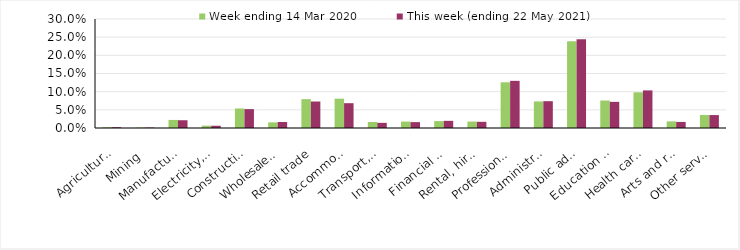
| Category | Week ending 14 Mar 2020 | This week (ending 22 May 2021) |
|---|---|---|
| Agriculture, forestry and fishing | 0.002 | 0.002 |
| Mining | 0.001 | 0.001 |
| Manufacturing | 0.022 | 0.021 |
| Electricity, gas, water and waste services | 0.006 | 0.006 |
| Construction | 0.054 | 0.052 |
| Wholesale trade | 0.016 | 0.017 |
| Retail trade | 0.079 | 0.073 |
| Accommodation and food services | 0.081 | 0.068 |
| Transport, postal and warehousing | 0.017 | 0.014 |
| Information media and telecommunications | 0.018 | 0.016 |
| Financial and insurance services | 0.019 | 0.02 |
| Rental, hiring and real estate services | 0.018 | 0.017 |
| Professional, scientific and technical services | 0.126 | 0.13 |
| Administrative and support services | 0.073 | 0.074 |
| Public administration and safety | 0.239 | 0.245 |
| Education and training | 0.076 | 0.072 |
| Health care and social assistance | 0.098 | 0.104 |
| Arts and recreation services | 0.018 | 0.017 |
| Other services | 0.036 | 0.036 |